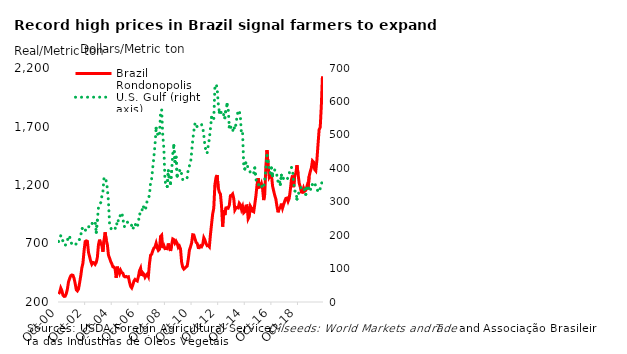
| Category | Brazil |
|---|---|
| 2000-10-01 | 267.8 |
| 2000-11-01 | 282.7 |
| 2000-12-01 | 319 |
| 2001-01-01 | 297.2 |
| 2001-02-01 | 257.8 |
| 2001-03-01 | 247.8 |
| 2001-04-01 | 249.7 |
| 2001-05-01 | 272 |
| 2001-06-01 | 311.2 |
| 2001-07-01 | 373.833 |
| 2001-08-01 | 401.333 |
| 2001-09-01 | 424.333 |
| 2001-10-01 | 430.833 |
| 2001-11-01 | 427.5 |
| 2001-12-01 | 402 |
| 2002-01-01 | 357.333 |
| 2002-02-01 | 305.167 |
| 2002-03-01 | 295 |
| 2002-04-01 | 311 |
| 2002-05-01 | 364.167 |
| 2002-06-01 | 421.167 |
| 2002-07-01 | 491 |
| 2002-08-01 | 532.333 |
| 2002-09-01 | 636.333 |
| 2002-10-01 | 716.833 |
| 2002-11-01 | 722.5 |
| 2002-12-01 | 718.833 |
| 2003-01-01 | 624 |
| 2003-02-01 | 587.833 |
| 2003-03-01 | 548.333 |
| 2003-04-01 | 522.667 |
| 2003-05-01 | 538 |
| 2003-06-01 | 535.333 |
| 2003-07-01 | 521.667 |
| 2003-08-01 | 538 |
| 2003-09-01 | 581.333 |
| 2003-10-01 | 689.667 |
| 2003-11-01 | 732.833 |
| 2003-12-01 | 695.333 |
| 2004-01-01 | 686.833 |
| 2004-02-01 | 629.833 |
| 2004-03-01 | 725.5 |
| 2004-04-01 | 795.833 |
| 2004-05-01 | 729.167 |
| 2004-06-01 | 691.667 |
| 2004-07-01 | 601 |
| 2004-08-01 | 575 |
| 2004-09-01 | 547.167 |
| 2004-10-01 | 527.333 |
| 2004-11-01 | 500.833 |
| 2004-12-01 | 498.833 |
| 2005-01-01 | 481.667 |
| 2005-02-01 | 407.167 |
| 2005-03-01 | 502.167 |
| 2005-04-01 | 464.667 |
| 2005-05-01 | 441.333 |
| 2005-06-01 | 470.833 |
| 2005-07-01 | 452.167 |
| 2005-08-01 | 446 |
| 2005-09-01 | 420.5 |
| 2005-10-01 | 415 |
| 2005-11-01 | 418.333 |
| 2005-12-01 | 413.333 |
| 2006-01-01 | 415.833 |
| 2006-02-01 | 368.333 |
| 2006-03-01 | 333.333 |
| 2006-04-01 | 320.5 |
| 2006-05-01 | 345.833 |
| 2006-06-01 | 379.667 |
| 2006-07-01 | 392.833 |
| 2006-08-01 | 385 |
| 2006-09-01 | 379.5 |
| 2006-10-01 | 416.667 |
| 2006-11-01 | 466.667 |
| 2006-12-01 | 488.833 |
| 2007-01-01 | 422.167 |
| 2007-02-01 | 448.833 |
| 2007-03-01 | 437.5 |
| 2007-04-01 | 411.167 |
| 2007-05-01 | 426.667 |
| 2007-06-01 | 439.167 |
| 2007-07-01 | 419.167 |
| 2007-08-01 | 527.833 |
| 2007-09-01 | 600 |
| 2007-10-01 | 608.333 |
| 2007-11-01 | 639.333 |
| 2007-12-01 | 661.167 |
| 2008-01-01 | 670.833 |
| 2008-02-01 | 702.167 |
| 2008-03-01 | 662.5 |
| 2008-04-01 | 640.833 |
| 2008-05-01 | 650 |
| 2008-06-01 | 760.5 |
| 2008-07-01 | 770.833 |
| 2008-08-01 | 660.5 |
| 2008-09-01 | 681.667 |
| 2008-10-01 | 656.333 |
| 2008-11-01 | 658.333 |
| 2008-12-01 | 655.5 |
| 2009-01-01 | 700 |
| 2009-02-01 | 663.833 |
| 2009-03-01 | 636.167 |
| 2009-04-01 | 687.5 |
| 2009-05-01 | 738.833 |
| 2009-06-01 | 733.333 |
| 2009-07-01 | 704.167 |
| 2009-08-01 | 719.5 |
| 2009-09-01 | 701.333 |
| 2009-10-01 | 666.667 |
| 2009-11-01 | 677.833 |
| 2009-12-01 | 652.833 |
| 2010-01-01 | 539.833 |
| 2010-02-01 | 496.667 |
| 2010-03-01 | 481.333 |
| 2010-04-01 | 489.333 |
| 2010-05-01 | 500 |
| 2010-06-01 | 506.667 |
| 2010-07-01 | 565.833 |
| 2010-08-01 | 643.333 |
| 2010-09-01 | 671.333 |
| 2010-10-01 | 704.167 |
| 2010-11-01 | 775 |
| 2010-12-01 | 772.833 |
| 2011-01-01 | 741.667 |
| 2011-02-01 | 710.5 |
| 2011-03-01 | 701.667 |
| 2011-04-01 | 665 |
| 2011-05-01 | 663.833 |
| 2011-06-01 | 680.5 |
| 2011-07-01 | 673.333 |
| 2011-08-01 | 692.167 |
| 2011-09-01 | 749.167 |
| 2011-10-01 | 729.667 |
| 2011-11-01 | 701.333 |
| 2011-12-01 | 681.167 |
| 2012-01-01 | 684 |
| 2012-02-01 | 672.167 |
| 2012-03-01 | 776.333 |
| 2012-04-01 | 866.667 |
| 2012-05-01 | 952.167 |
| 2012-06-01 | 1002.333 |
| 2012-07-01 | 1202.167 |
| 2012-08-01 | 1264.667 |
| 2012-09-01 | 1285.5 |
| 2012-10-01 | 1176.333 |
| 2012-11-01 | 1139 |
| 2012-12-01 | 1122.167 |
| 2013-01-01 | 1019.667 |
| 2013-02-01 | 844.167 |
| 2013-03-01 | 986.667 |
| 2013-04-01 | 943.167 |
| 2013-05-01 | 1004.167 |
| 2013-06-01 | 1006.333 |
| 2013-07-01 | 1002.167 |
| 2013-08-01 | 1026 |
| 2013-09-01 | 1108.333 |
| 2013-10-01 | 1112.167 |
| 2013-11-01 | 1123.333 |
| 2013-12-01 | 1084.333 |
| 2014-01-01 | 986.667 |
| 2014-02-01 | 1003.833 |
| 2014-03-01 | 1008.167 |
| 2014-04-01 | 1004.167 |
| 2014-05-01 | 1044.167 |
| 2014-06-01 | 1031.333 |
| 2014-07-01 | 991.667 |
| 2014-08-01 | 1016.667 |
| 2014-09-01 | 962.5 |
| 2014-10-01 | 971.667 |
| 2014-11-01 | 1020.833 |
| 2014-12-01 | 1023 |
| 2015-01-01 | 911 |
| 2015-02-01 | 930.167 |
| 2015-03-01 | 1019 |
| 2015-04-01 | 1002.167 |
| 2015-05-01 | 976 |
| 2015-06-01 | 970.833 |
| 2015-07-01 | 1037.5 |
| 2015-08-01 | 1107.667 |
| 2015-09-01 | 1202.167 |
| 2015-10-01 | 1258.333 |
| 2015-11-01 | 1180.167 |
| 2015-12-01 | 1183.333 |
| 2016-01-01 | 1211.167 |
| 2016-02-01 | 1168.833 |
| 2016-03-01 | 1070.833 |
| 2016-04-01 | 1125.833 |
| 2016-05-01 | 1364.667 |
| 2016-06-01 | 1498 |
| 2016-07-01 | 1361.667 |
| 2016-08-01 | 1269.5 |
| 2016-09-01 | 1289.333 |
| 2016-10-01 | 1289.667 |
| 2016-11-01 | 1191.667 |
| 2016-12-01 | 1150 |
| 2017-01-01 | 1110.5 |
| 2017-02-01 | 1079.167 |
| 2017-03-01 | 1015 |
| 2017-04-01 | 966.667 |
| 2017-05-01 | 1002.167 |
| 2017-06-01 | 1006.667 |
| 2017-07-01 | 1040.833 |
| 2017-08-01 | 1002.167 |
| 2017-09-01 | 1033.333 |
| 2017-10-01 | 1062.5 |
| 2017-11-01 | 1085.5 |
| 2017-12-01 | 1088.333 |
| 2018-01-01 | 1060.5 |
| 2018-02-01 | 1085.5 |
| 2018-03-01 | 1155 |
| 2018-04-01 | 1243.833 |
| 2018-05-01 | 1281.333 |
| 2018-06-01 | 1181.667 |
| 2018-07-01 | 1283.333 |
| 2018-08-01 | 1300 |
| 2018-09-01 | 1368.833 |
| 2018-10-01 | 1295.833 |
| 2018-11-01 | 1216.667 |
| 2018-12-01 | 1183.333 |
| 2019-01-01 | 1139.667 |
| 2019-02-01 | 1137.5 |
| 2019-03-01 | 1173.333 |
| 2019-04-01 | 1148 |
| 2019-05-01 | 1155 |
| 2019-06-01 | 1188.5 |
| 2019-07-01 | 1162.5 |
| 2019-08-01 | 1274.167 |
| 2019-09-01 | 1314.667 |
| 2019-10-01 | 1345.833 |
| 2019-11-01 | 1406.333 |
| 2019-12-01 | 1395.833 |
| 2020-01-01 | 1332.5 |
| 2020-02-01 | 1320.833 |
| 2020-03-01 | 1412.5 |
| 2020-04-01 | 1545.833 |
| 2020-05-01 | 1672.5 |
| 2020-06-01 | 1693.833 |
| 2020-07-01 | 1878.333 |
| 2020-08-01 | 2129.167 |